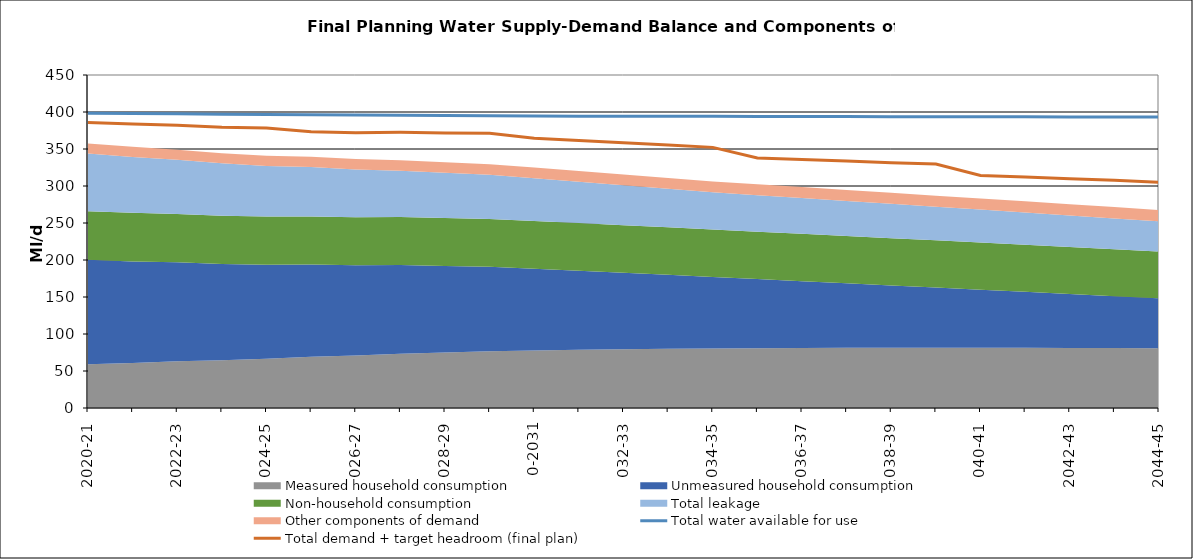
| Category | Total water available for use | Total demand + target headroom (final plan) |
|---|---|---|
| 0 | 398.29 | 385.964 |
| 1 | 397.902 | 383.76 |
| 2 | 397.514 | 382.183 |
| 3 | 397.126 | 379.482 |
| 4 | 396.738 | 378.289 |
| 5 | 396.35 | 373.207 |
| 6 | 395.962 | 371.923 |
| 7 | 395.574 | 372.484 |
| 8 | 395.186 | 371.726 |
| 9 | 394.798 | 371.133 |
| 10 | 394.507 | 364.405 |
| 11 | 394.41 | 361.397 |
| 12 | 394.313 | 358.546 |
| 13 | 394.216 | 355.335 |
| 14 | 394.119 | 352.198 |
| 15 | 394.022 | 337.931 |
| 16 | 393.925 | 335.898 |
| 17 | 393.829 | 333.665 |
| 18 | 393.732 | 331.557 |
| 19 | 393.635 | 329.571 |
| 20 | 393.538 | 314.16 |
| 21 | 393.441 | 312.163 |
| 22 | 393.344 | 309.848 |
| 23 | 393.247 | 307.644 |
| 24 | 393.15 | 305.143 |